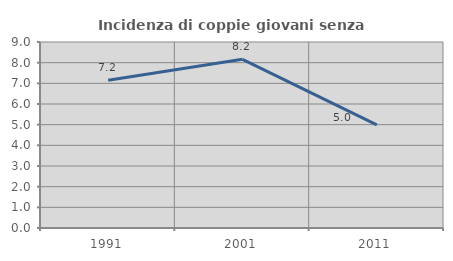
| Category | Incidenza di coppie giovani senza figli |
|---|---|
| 1991.0 | 7.15 |
| 2001.0 | 8.163 |
| 2011.0 | 4.992 |